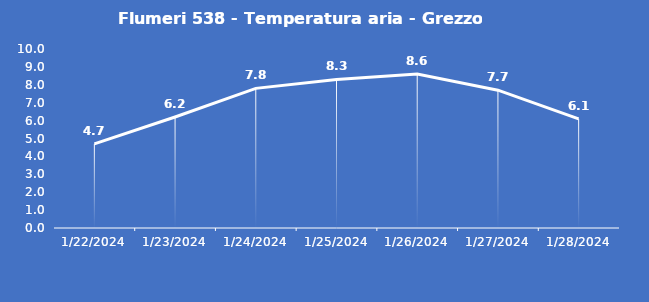
| Category | Flumeri 538 - Temperatura aria - Grezzo (°C) |
|---|---|
| 1/22/24 | 4.7 |
| 1/23/24 | 6.2 |
| 1/24/24 | 7.8 |
| 1/25/24 | 8.3 |
| 1/26/24 | 8.6 |
| 1/27/24 | 7.7 |
| 1/28/24 | 6.1 |